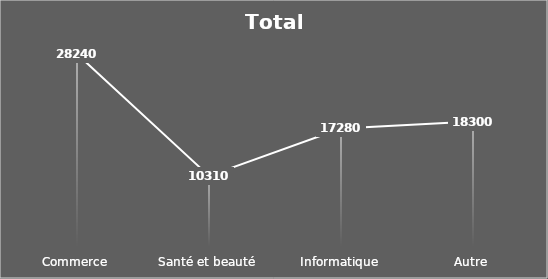
| Category | Total |
|---|---|
| Commerce | 282400 |
| Santé et beauté | 103100 |
| Informatique | 172800 |
| Autre | 183000 |